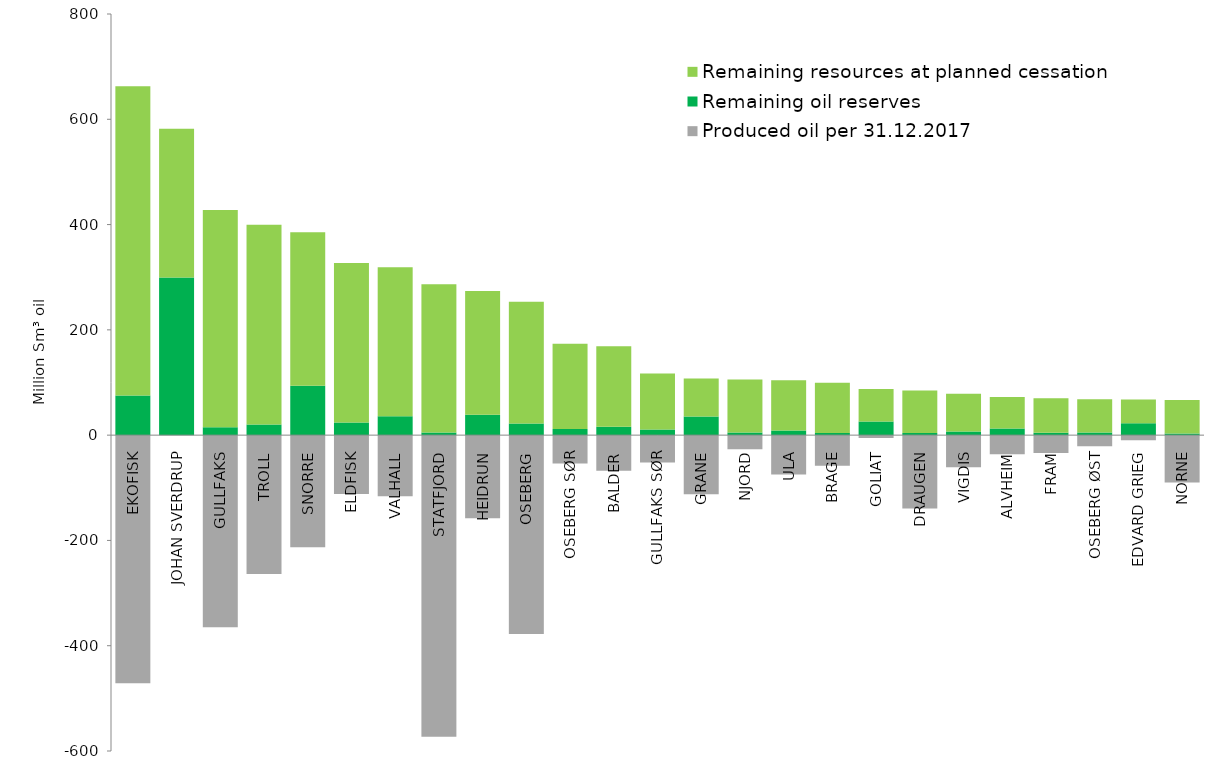
| Category | Produced oil per 31.12.2017 | Remaining oil reserves | Remaining resources at planned cessation |
|---|---|---|---|
| EKOFISK | -471.5 | 75.28 | 587.41 |
| JOHAN SVERDRUP | 0 | 299.67 | 282.33 |
| GULLFAKS | -365.01 | 14.76 | 412.83 |
| TROLL | -263.75 | 20.17 | 379.57 |
| SNORRE | -212.81 | 93.84 | 291.34 |
| ELDFISK | -111.78 | 24.18 | 302.85 |
| VALHALL | -116.07 | 35.87 | 283.28 |
| STATFJORD | -573.14 | 4.83 | 281.85 |
| HEIDRUN | -158.01 | 38.54 | 235.45 |
| OSEBERG | -377.63 | 22.19 | 231.32 |
| OSEBERG SØR | -54.06 | 11.82 | 161.92 |
| BALDER | -67.64 | 15.74 | 153.15 |
| GULLFAKS SØR | -51.77 | 10.57 | 106.54 |
| GRANE | -112.48 | 35.46 | 72.06 |
| NJORD | -26.66 | 4.83 | 100.7 |
| ULA | -74.84 | 8.59 | 95.91 |
| BRAGE | -58.25 | 4.25 | 95.3 |
| GOLIAT | -5.49 | 26.08 | 61.51 |
| DRAUGEN | -139.54 | 3.84 | 81.01 |
| VIGDIS | -60.78 | 6.77 | 71.85 |
| ALVHEIM | -36.47 | 12.7 | 59.76 |
| FRAM | -33.85 | 4.59 | 65.55 |
| OSEBERG ØST | -21.15 | 4.87 | 63.18 |
| EDVARD GRIEG | -9.47 | 22.55 | 45.09 |
| NORNE | -90.1 | 2.99 | 63.91 |